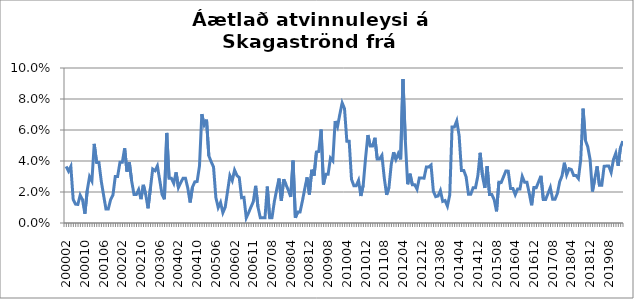
| Category | Series 0 |
|---|---|
| 200002 | 0.036 |
| 200003 | 0.033 |
| 200004 | 0.036 |
| 200005 | 0.015 |
| 200006 | 0.012 |
| 200007 | 0.012 |
| 200008 | 0.018 |
| 200009 | 0.015 |
| 200010 | 0.006 |
| 200011 | 0.021 |
| 200012 | 0.03 |
| 200101 | 0.027 |
| 200102 | 0.051 |
| 200103 | 0.039 |
| 200104 | 0.039 |
| 200105 | 0.027 |
| 200106 | 0.018 |
| 200107 | 0.009 |
| 200108 | 0.009 |
| 200109 | 0.015 |
| 200110 | 0.018 |
| 200111 | 0.03 |
| 200112 | 0.03 |
| 200201 | 0.039 |
| 200202 | 0.039 |
| 200203 | 0.048 |
| 200204 | 0.033 |
| 200205 | 0.039 |
| 200206 | 0.027 |
| 200207 | 0.018 |
| 200208 | 0.018 |
| 200209 | 0.022 |
| 200210 | 0.015 |
| 200211 | 0.025 |
| 200212 | 0.018 |
| 200301 | 0.009 |
| 200302 | 0.022 |
| 200303 | 0.035 |
| 200304 | 0.034 |
| 200305 | 0.037 |
| 200306 | 0.028 |
| 200307 | 0.018 |
| 200308 | 0.015 |
| 200309 | 0.058 |
| 200310 | 0.029 |
| 200311 | 0.029 |
| 200312 | 0.026 |
| 200401 | 0.033 |
| 200402 | 0.023 |
| 200403 | 0.026 |
| 200404 | 0.029 |
| 200405 | 0.029 |
| 200406 | 0.023 |
| 200407 | 0.013 |
| 200408 | 0.023 |
| 200409 | 0.026 |
| 200410 | 0.027 |
| 200411 | 0.037 |
| 200412 | 0.07 |
| 200501 | 0.063 |
| 200502 | 0.067 |
| 200503 | 0.043 |
| 200504 | 0.039 |
| 200505 | 0.036 |
| 200506 | 0.016 |
| 200507 | 0.01 |
| 200508 | 0.013 |
| 200509 | 0.007 |
| 200510 | 0.01 |
| 200511 | 0.02 |
| 200512 | 0.031 |
| 200601 | 0.027 |
| 200602 | 0.034 |
| 200603 | 0.031 |
| 200604 | 0.029 |
| 200605 | 0.016 |
| 200607 | 0.017 |
| 200608 | 0.003 |
| 200609 | 0.007 |
| 200610 | 0.01 |
| 200611 | 0.014 |
| 200612 | 0.024 |
| 200701 | 0.01 |
| 200702 | 0.003 |
| 200703 | 0.003 |
| 200704 | 0.003 |
| 200705 | 0.023 |
| 200706 | 0.003 |
| 200708 | 0.003 |
| 200709 | 0.014 |
| 200710 | 0.022 |
| 200711 | 0.029 |
| 200712 | 0.014 |
| 200801 | 0.028 |
| 200802 | 0.025 |
| 200803 | 0.021 |
| 200804 | 0.017 |
| 200805 | 0.04 |
| 200806 | 0.003 |
| 200807 | 0.007 |
| 200808 | 0.007 |
| 200809 | 0.014 |
| 200810 | 0.022 |
| 200811 | 0.029 |
| 200812 | 0.018 |
| 200901 | 0.034 |
| 200902 | 0.031 |
| 200903 | 0.046 |
| 200904 | 0.046 |
| 200905 | 0.06 |
| 200906 | 0.025 |
| 200907 | 0.031 |
| 200908 | 0.031 |
| 200909 | 0.042 |
| 200910 | 0.04 |
| 200911 | 0.066 |
| 200912 | 0.062 |
| 201001 | 0.07 |
| 201002 | 0.077 |
| 201003 | 0.074 |
| 201004 | 0.053 |
| 201005 | 0.053 |
| 201006 | 0.028 |
| 201007 | 0.024 |
| 201008 | 0.024 |
| 201009 | 0.027 |
| 201010 | 0.017 |
| 201011 | 0.024 |
| 201012 | 0.042 |
| 201101 | 0.057 |
| 201102 | 0.05 |
| 201103 | 0.05 |
| 201104 | 0.055 |
| 201105 | 0.041 |
| 201106 | 0.041 |
| 201107 | 0.044 |
| 201108 | 0.029 |
| 201109 | 0.018 |
| 201110 | 0.023 |
| 201111 | 0.038 |
| 201112 | 0.046 |
| 201201 | 0.041 |
| 201202 | 0.045 |
| 201203 | 0.041 |
| 201204 | 0.093 |
| 201205 | 0.054 |
| 201206 | 0.025 |
| 201207 | 0.032 |
| 201208 | 0.025 |
| 201209 | 0.025 |
| 201210 | 0.022 |
| 201211 | 0.029 |
| 201212 | 0.029 |
| 201301 | 0.029 |
| 201302 | 0.036 |
| 201303 | 0.036 |
| 201304 | 0.037 |
| 201305 | 0.02 |
| 201306 | 0.017 |
| 201307 | 0.017 |
| 201308 | 0.021 |
| 201309 | 0.014 |
| 201310 | 0.014 |
| 201311 | 0.011 |
| 201312 | 0.018 |
| 201401 | 0.062 |
| 201402 | 0.062 |
| 201403 | 0.066 |
| 201404 | 0.056 |
| 201405 | 0.034 |
| 201406 | 0.034 |
| 201407 | 0.03 |
| 201408 | 0.019 |
| 201409 | 0.019 |
| 201410 | 0.023 |
| 201411 | 0.023 |
| 201412 | 0.03 |
| 201501 | 0.045 |
| 201502 | 0.03 |
| 201503 | 0.023 |
| 201504 | 0.037 |
| 201505 | 0.018 |
| 201506 | 0.018 |
| 201507 | 0.015 |
| 201508 | 0.008 |
| 201509 | 0.026 |
| 201510 | 0.026 |
| 201511 | 0.03 |
| 201512 | 0.034 |
| 201601 | 0.033 |
| 201602 | 0.022 |
| 201603 | 0.022 |
| 201604 | 0.018 |
| 201605 | 0.022 |
| 201606 | 0.022 |
| 201607 | 0.03 |
| 201608 | 0.026 |
| 201609 | 0.026 |
| 201610 | 0.019 |
| 201611 | 0.011 |
| 201612 | 0.023 |
| 201701 | 0.023 |
| 201702 | 0.027 |
| 201703 | 0.03 |
| 201704 | 0.015 |
| 201705 | 0.015 |
| 201706 | 0.019 |
| 201707 | 0.023 |
| 201708 | 0.015 |
| 201709 | 0.015 |
| 201710 | 0.019 |
| 201711 | 0.027 |
| 201712 | 0.03 |
| 201801 | 0.039 |
| 201802 | 0.031 |
| 201803 | 0.035 |
| 201804 | 0.034 |
| 201805 | 0.031 |
| 201806 | 0.031 |
| 201807 | 0.029 |
| 201808 | 0.041 |
| 201809 | 0.074 |
| 201810 | 0.053 |
| 201811 | 0.049 |
| 201812 | 0.041 |
| 201901 | 0.02 |
| 201902 | 0.028 |
| 201903 | 0.037 |
| 201904 | 0.024 |
| 201905 | 0.024 |
| 201906 | 0.037 |
| 201907 | 0.037 |
| 201908 | 0.037 |
| 201909 | 0.033 |
| 201910 | 0.041 |
| 201911 | 0.045 |
| 201912 | 0.037 |
| 202001 | 0.049 |
| 202002 | 0.053 |